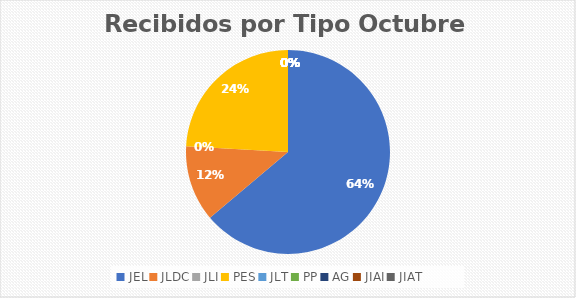
| Category | Series 0 |
|---|---|
| JEL | 53 |
| JLDC | 10 |
| JLI | 0 |
| PES | 20 |
| JLT | 0 |
| PP | 0 |
| AG | 0 |
| JIAI | 0 |
| JIAT | 0 |